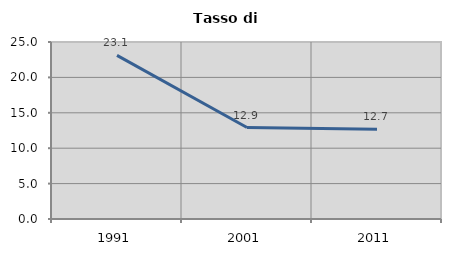
| Category | Tasso di disoccupazione   |
|---|---|
| 1991.0 | 23.114 |
| 2001.0 | 12.915 |
| 2011.0 | 12.688 |